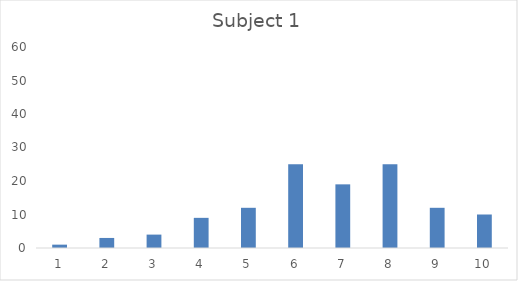
| Category | Series 0 |
|---|---|
| 0 | 1 |
| 1 | 3 |
| 2 | 4 |
| 3 | 9 |
| 4 | 12 |
| 5 | 25 |
| 6 | 19 |
| 7 | 25 |
| 8 | 12 |
| 9 | 10 |